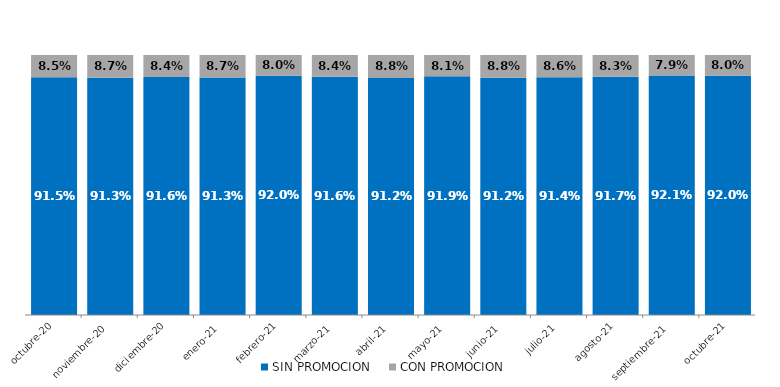
| Category | SIN PROMOCION   | CON PROMOCION   |
|---|---|---|
| 2020-10-01 | 0.915 | 0.085 |
| 2020-11-01 | 0.913 | 0.087 |
| 2020-12-01 | 0.916 | 0.084 |
| 2021-01-01 | 0.913 | 0.087 |
| 2021-02-01 | 0.92 | 0.08 |
| 2021-03-01 | 0.916 | 0.084 |
| 2021-04-01 | 0.912 | 0.088 |
| 2021-05-01 | 0.919 | 0.081 |
| 2021-06-01 | 0.912 | 0.088 |
| 2021-07-01 | 0.914 | 0.086 |
| 2021-08-01 | 0.917 | 0.083 |
| 2021-09-01 | 0.921 | 0.079 |
| 2021-10-01 | 0.92 | 0.08 |